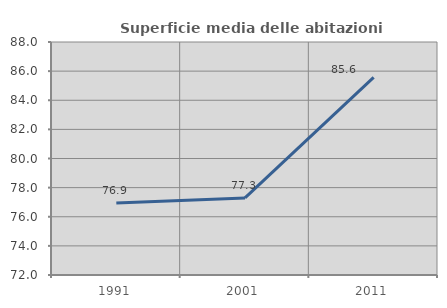
| Category | Superficie media delle abitazioni occupate |
|---|---|
| 1991.0 | 76.946 |
| 2001.0 | 77.291 |
| 2011.0 | 85.576 |